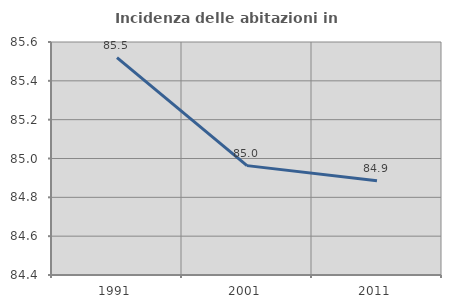
| Category | Incidenza delle abitazioni in proprietà  |
|---|---|
| 1991.0 | 85.52 |
| 2001.0 | 84.963 |
| 2011.0 | 84.885 |